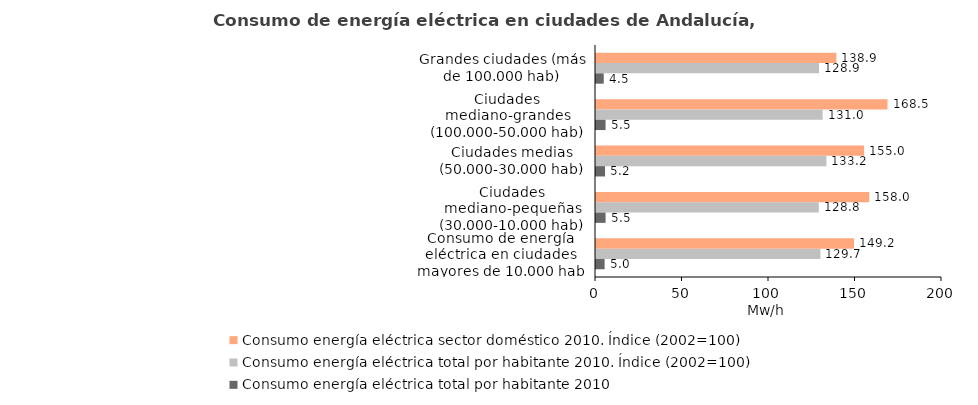
| Category | Consumo energía eléctrica sector doméstico 2010. Índice (2002=100) | Consumo energía eléctrica total por habitante 2010. Índice (2002=100) | Consumo energía eléctrica total por habitante 2010 |
|---|---|---|---|
| Grandes ciudades (más de 100.000 hab) | 138.937 | 128.929 | 4.482 |
| Ciudades mediano-grandes (100.000-50.000 hab) | 168.531 | 131.008 | 5.537 |
| Ciudades medias (50.000-30.000 hab) | 155.011 | 133.195 | 5.228 |
| Ciudades mediano-pequeñas (30.000-10.000 hab) | 157.962 | 128.799 | 5.537 |
| Consumo de energía eléctrica en ciudades mayores de 10.000 hab | 149.158 | 129.71 | 4.986 |